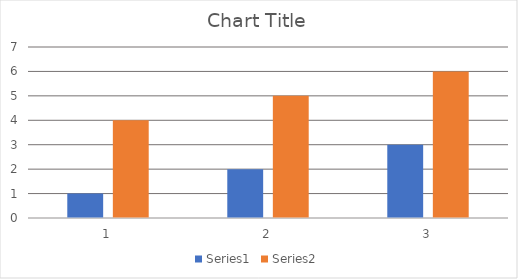
| Category | Series 0 | Series 1 |
|---|---|---|
| 0 | 1 | 4 |
| 1 | 2 | 5 |
| 2 | 3 | 6 |